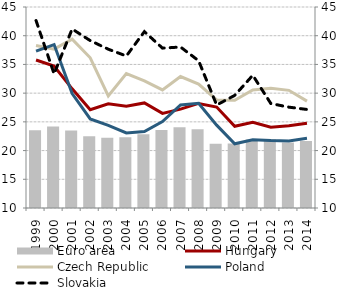
| Category | Euro area |
|---|---|
| 1999 | 23.52 |
| 2000 | 24.18 |
| 2001 | 23.51 |
| 2002 | 22.51 |
| 2003 | 22.22 |
| 2004 | 22.32 |
| 2005 | 22.84 |
| 2006 | 23.6 |
| 2007 | 24.08 |
| 2008 | 23.72 |
| 2009 | 21.17 |
| 2010 | 21.21 |
| 2011 | 21.93 |
| 2012 | 21.98 |
| 2013 | 21.41 |
| 2014 | 21.68 |